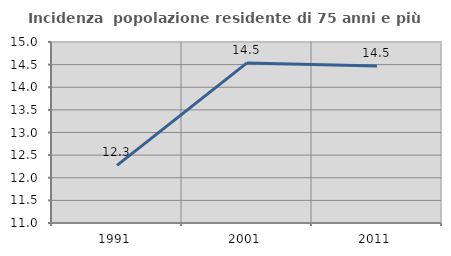
| Category | Incidenza  popolazione residente di 75 anni e più |
|---|---|
| 1991.0 | 12.273 |
| 2001.0 | 14.538 |
| 2011.0 | 14.47 |